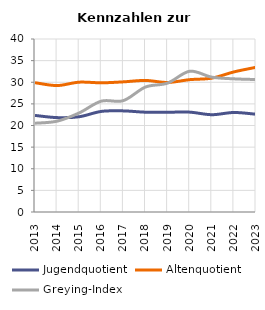
| Category | Jugendquotient | Altenquotient | Greying-Index |
|---|---|---|---|
| 2013.0 | 22.327 | 29.896 | 20.524 |
| 2014.0 | 21.823 | 29.236 | 20.999 |
| 2015.0 | 22.025 | 30.018 | 22.907 |
| 2016.0 | 23.256 | 29.868 | 25.63 |
| 2017.0 | 23.379 | 30.091 | 25.755 |
| 2018.0 | 23.073 | 30.417 | 28.895 |
| 2019.0 | 23.063 | 29.95 | 29.802 |
| 2020.0 | 23.09 | 30.6 | 32.54 |
| 2021.0 | 22.496 | 30.948 | 31.181 |
| 2022.0 | 23.01 | 32.39 | 30.79 |
| 2023.0 | 22.604 | 33.454 | 30.628 |